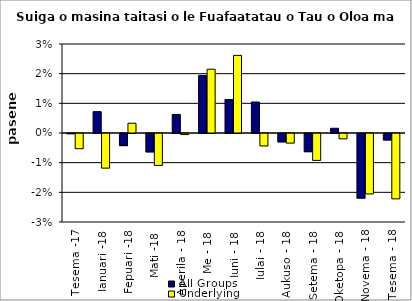
| Category | All Groups | Underlying |
|---|---|---|
| Tesema -17 | 0 | -0.005 |
| Ianuari -18 | 0.007 | -0.012 |
| Fepuari -18 | -0.004 | 0.003 |
| Mati -18 | -0.006 | -0.011 |
| Aperila - 18 | 0.006 | 0 |
| Me - 18 | 0.019 | 0.021 |
| Iuni - 18 | 0.011 | 0.026 |
| Iulai - 18 | 0.01 | -0.004 |
| Aukuso - 18 | -0.003 | -0.003 |
| Setema - 18 | -0.006 | -0.009 |
| Oketopa - 18 | 0.002 | -0.002 |
| Novema - 18 | -0.022 | -0.02 |
| Tesema - 18 | -0.002 | -0.022 |